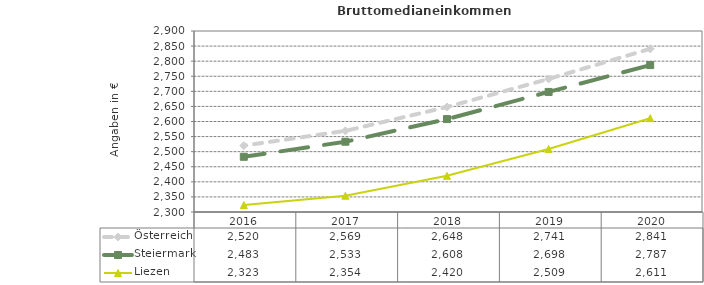
| Category | Österreich | Steiermark | Liezen |
|---|---|---|---|
| 2020.0 | 2841 | 2787 | 2611 |
| 2019.0 | 2741 | 2698 | 2509 |
| 2018.0 | 2648 | 2608 | 2420 |
| 2017.0 | 2569 | 2533 | 2354 |
| 2016.0 | 2520 | 2483 | 2323 |